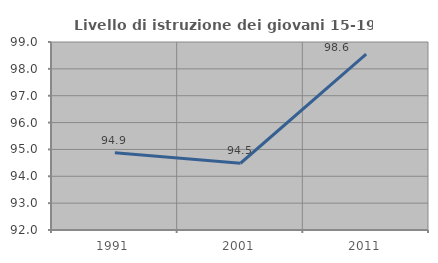
| Category | Livello di istruzione dei giovani 15-19 anni |
|---|---|
| 1991.0 | 94.88 |
| 2001.0 | 94.485 |
| 2011.0 | 98.551 |